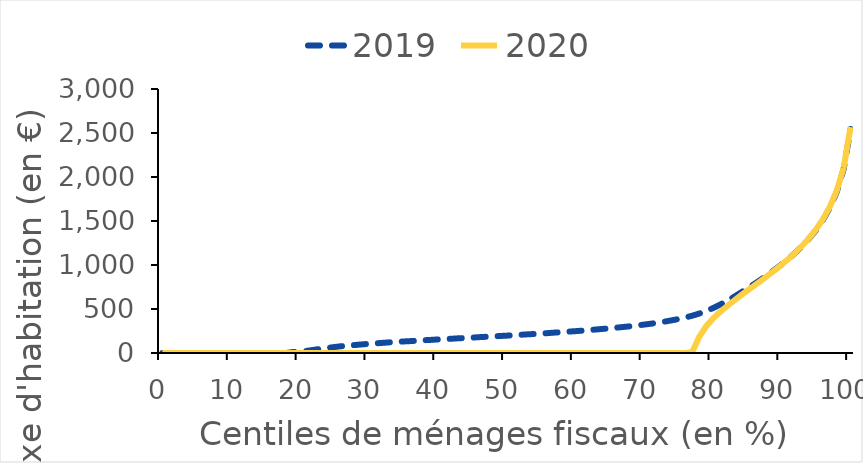
| Category | 2019 | 2020 |
|---|---|---|
| 0.0 | 0 | 0 |
| 1.0 | 0 | 0 |
| 2.0 | 0 | 0 |
| 3.0 | 0 | 0 |
| 4.0 | 0 | 0 |
| 5.0 | 0 | 0 |
| 6.0 | 0 | 0 |
| 7.0 | 0 | 0 |
| 8.0 | 0 | 0 |
| 9.0 | 0 | 0 |
| 10.0 | 0 | 0 |
| 11.0 | 0 | 0 |
| 12.0 | 0 | 0 |
| 13.0 | 0 | 0 |
| 14.0 | 0 | 0 |
| 15.0 | 0 | 0 |
| 16.0 | 0 | 0 |
| 17.0 | 0 | 0 |
| 18.0 | 0 | 0 |
| 19.0 | 12 | 0 |
| 20.0 | 15 | 0 |
| 21.0 | 25 | 0 |
| 22.0 | 36 | 0 |
| 23.0 | 48 | 0 |
| 24.0 | 58 | 0 |
| 25.0 | 68 | 0 |
| 26.0 | 77 | 0 |
| 27.0 | 84 | 0 |
| 28.0 | 91 | 0 |
| 29.0 | 98 | 0 |
| 30.0 | 104 | 0 |
| 31.0 | 110 | 0 |
| 32.0 | 115 | 0 |
| 33.0 | 121 | 0 |
| 34.0 | 126 | 0 |
| 35.0 | 131 | 0 |
| 36.0 | 135 | 0 |
| 37.0 | 140 | 0 |
| 38.0 | 145 | 0 |
| 39.0 | 149 | 0 |
| 40.0 | 154 | 0 |
| 41.0 | 158 | 0 |
| 42.0 | 162 | 0 |
| 43.0 | 167 | 0 |
| 44.0 | 171 | 0 |
| 45.0 | 175 | 0 |
| 46.0 | 180 | 0 |
| 47.0 | 184 | 0 |
| 48.0 | 188 | 0 |
| 49.0 | 193 | 0 |
| 50.0 | 197 | 0 |
| 51.0 | 202 | 0 |
| 52.0 | 207 | 0 |
| 53.0 | 212 | 0 |
| 54.0 | 216 | 0 |
| 55.0 | 221 | 0 |
| 56.0 | 226 | 0 |
| 57.0 | 232 | 0 |
| 58.0 | 237 | 0 |
| 59.0 | 243 | 0 |
| 60.0 | 248 | 0 |
| 61.0 | 254 | 0 |
| 62.0 | 261 | 0 |
| 63.0 | 267 | 0 |
| 64.0 | 274 | 0 |
| 65.0 | 281 | 0 |
| 66.0 | 288 | 0 |
| 67.0 | 296 | 0 |
| 68.0 | 304 | 0 |
| 69.0 | 313 | 0 |
| 70.0 | 323 | 0 |
| 71.0 | 333 | 0 |
| 72.0 | 345 | 0 |
| 73.0 | 357 | 0 |
| 74.0 | 371 | 0 |
| 75.0 | 386 | 0 |
| 76.0 | 404 | 0 |
| 77.0 | 424 | 12 |
| 78.0 | 448 | 182 |
| 79.0 | 477 | 302 |
| 80.0 | 510 | 390 |
| 81.0 | 548 | 463 |
| 82.0 | 590 | 529 |
| 83.0 | 635 | 591 |
| 84.0 | 684 | 651 |
| 85.0 | 733 | 709 |
| 86.0 | 784 | 766 |
| 87.0 | 836 | 823 |
| 88.0 | 891 | 882 |
| 89.0 | 948 | 942 |
| 90.0 | 1008 | 1005 |
| 91.0 | 1072 | 1071 |
| 92.0 | 1142 | 1143 |
| 93.0 | 1218 | 1221 |
| 94.0 | 1302 | 1307 |
| 95.0 | 1399 | 1406 |
| 96.0 | 1513 | 1521 |
| 97.0 | 1652 | 1662 |
| 98.0 | 1832 | 1845 |
| 99.0 | 2090 | 2107 |
| 100.0 | 2545 | 2567 |